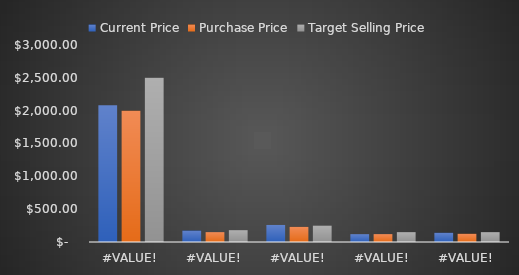
| Category | Current Price | Purchase Price | Target Selling Price |
|---|---|---|---|
| AMAZON.COM, INC. (XNAS:AMZN) | 2082 | 2000 | 2500 |
| UNITED PARCEL SERVICE, INC. (XNYS:UPS) | 174.11 | 150 | 180 |
| MICROSOFT CORPORATION (XNAS:MSFT) | 259.62 | 230 | 250 |
| THE BOEING COMPANY (XNYS:BA) | 119.4 | 120 | 150 |
| APPLE INC. (XNAS:AAPL) | 140.36 | 125 | 150 |